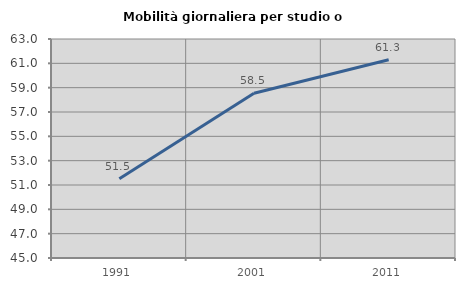
| Category | Mobilità giornaliera per studio o lavoro |
|---|---|
| 1991.0 | 51.511 |
| 2001.0 | 58.543 |
| 2011.0 | 61.29 |